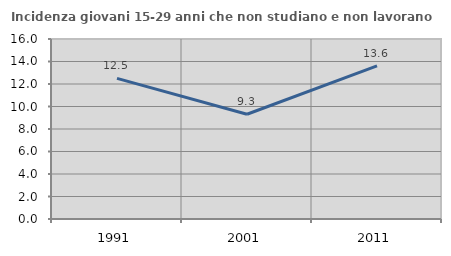
| Category | Incidenza giovani 15-29 anni che non studiano e non lavorano  |
|---|---|
| 1991.0 | 12.5 |
| 2001.0 | 9.312 |
| 2011.0 | 13.609 |